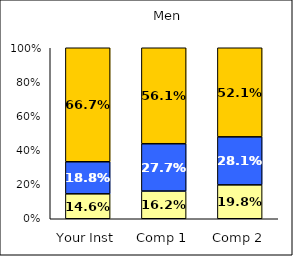
| Category | Low Habits of Mind | Average Habits of Mind | High Habits of Mind |
|---|---|---|---|
| Your Inst | 0.146 | 0.188 | 0.667 |
| Comp 1 | 0.162 | 0.277 | 0.561 |
| Comp 2 | 0.198 | 0.281 | 0.521 |